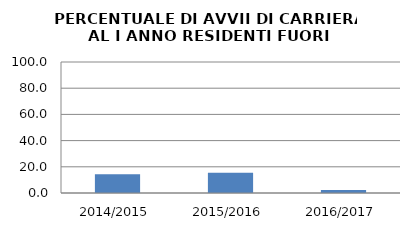
| Category | 2014/2015 2015/2016 2016/2017 |
|---|---|
| 2014/2015 | 14.286 |
| 2015/2016 | 15.385 |
| 2016/2017 | 2.222 |